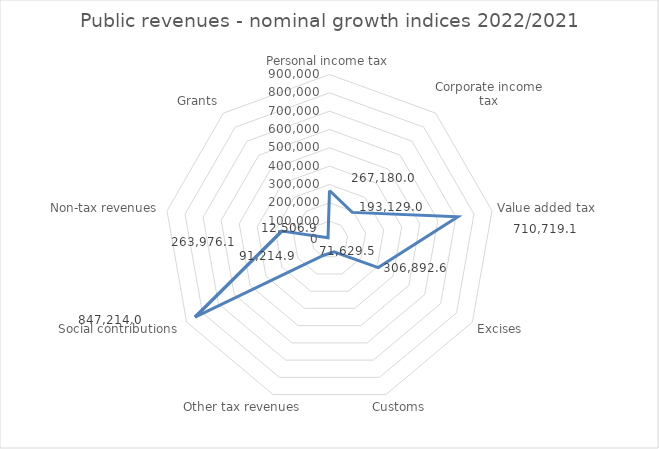
| Category | Series 0 |
|---|---|
| Personal income tax | 267180.043 |
| Corporate income tax | 193129.002 |
| Value added tax | 710719.1 |
| Excises | 306892.604 |
| Customs | 71629.506 |
| Other tax revenues | 91214.866 |
| Social contributions | 847214.01 |
| Non-tax revenues | 263976.093 |
| Grants | 12506.934 |